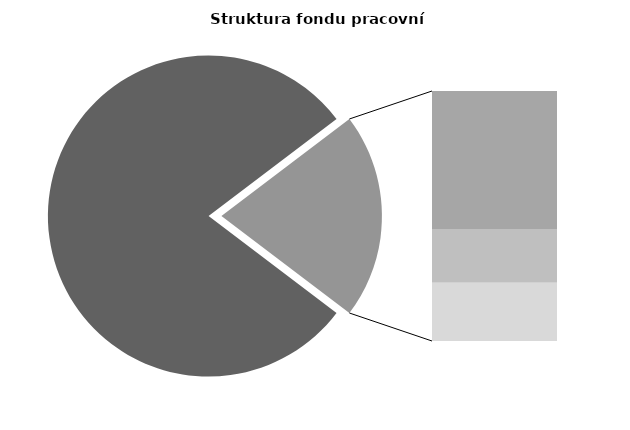
| Category | Series 0 |
|---|---|
| Průměrná měsíční odpracovaná doba bez přesčasu | 136.491 |
| Dovolená | 19.597 |
| Nemoc | 7.635 |
| Jiné | 8.283 |